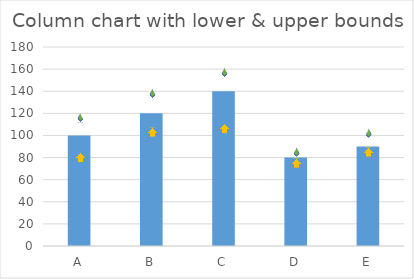
| Category | Value |
|---|---|
| A | 100 |
| B | 120 |
| C | 140 |
| D | 80 |
| E | 90 |